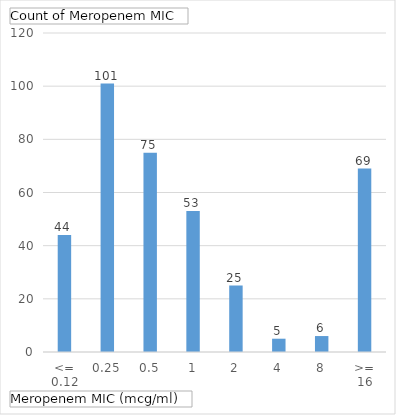
| Category | Total |
|---|---|
| <= 0.12 | 44 |
| 0.25 | 101 |
| 0.5 | 75 |
| 1 | 53 |
| 2 | 25 |
| 4 | 5 |
| 8 | 6 |
| >= 16 | 69 |